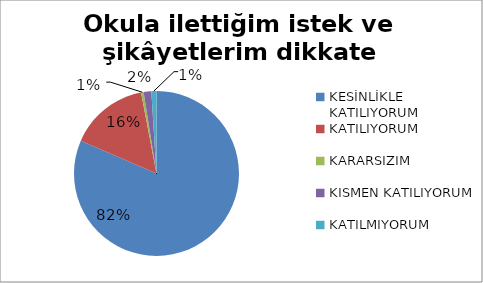
| Category | Okula ilettiğim istek ve şikâyetlerim dikkate alınıyor. |
|---|---|
| KESİNLİKLE KATILIYORUM | 163 |
| KATILIYORUM | 31 |
| KARARSIZIM | 1 |
| KISMEN KATILIYORUM | 3 |
| KATILMIYORUM | 2 |